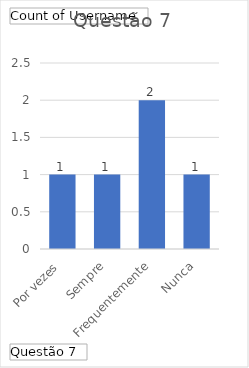
| Category | Total |
|---|---|
| Por vezes | 1 |
| Sempre | 1 |
| Frequentemente | 2 |
| Nunca | 1 |